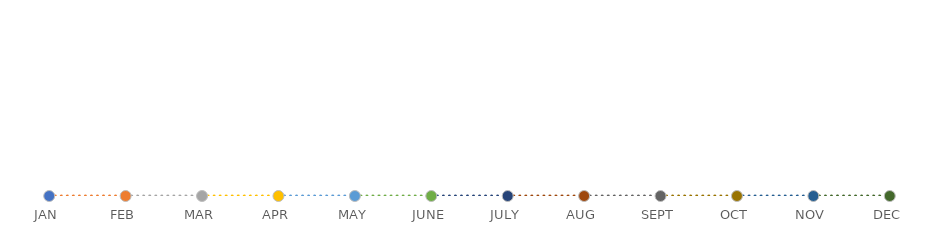
| Category | Series 0 |
|---|---|
| JAN | 0 |
| FEB | 0 |
| MAR | 0 |
| APR | 0 |
| MAY | 0 |
| JUNE | 0 |
| JULY | 0 |
| AUG | 0 |
| SEPT | 0 |
| OCT | 0 |
| NOV | 0 |
| DEC | 0 |